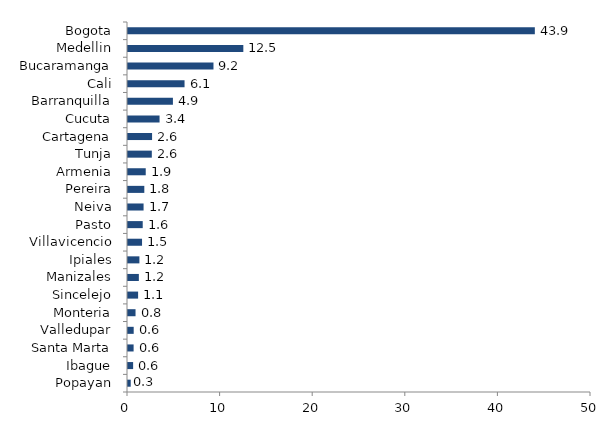
| Category | Series 0 |
|---|---|
| Popayan | 0.294 |
| Ibague | 0.553 |
| Santa Marta | 0.606 |
| Valledupar | 0.615 |
| Monteria | 0.814 |
| Sincelejo | 1.091 |
| Manizales | 1.173 |
| Ipiales | 1.232 |
| Villavicencio | 1.517 |
| Pasto | 1.59 |
| Neiva | 1.682 |
| Pereira | 1.762 |
| Armenia | 1.915 |
| Tunja | 2.572 |
| Cartagena | 2.599 |
| Cucuta | 3.408 |
| Barranquilla | 4.851 |
| Cali | 6.106 |
| Bucaramanga | 9.231 |
| Medellin | 12.455 |
| Bogota | 43.935 |